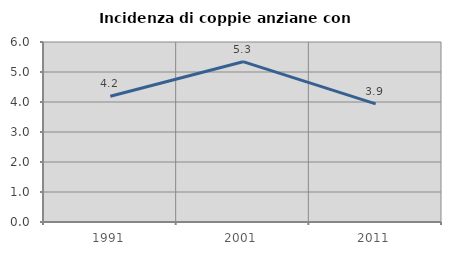
| Category | Incidenza di coppie anziane con figli |
|---|---|
| 1991.0 | 4.193 |
| 2001.0 | 5.344 |
| 2011.0 | 3.94 |